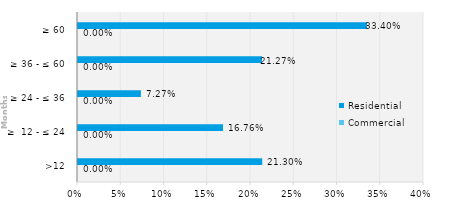
| Category | Commercial | Residential |
|---|---|---|
| >12 | 0 | 0.213 |
| ≥  12 - ≤ 24 | 0 | 0.168 |
| ≥ 24 - ≤ 36 | 0 | 0.073 |
| ≥ 36 - ≤ 60 | 0 | 0.213 |
| ≥ 60 | 0 | 0.334 |